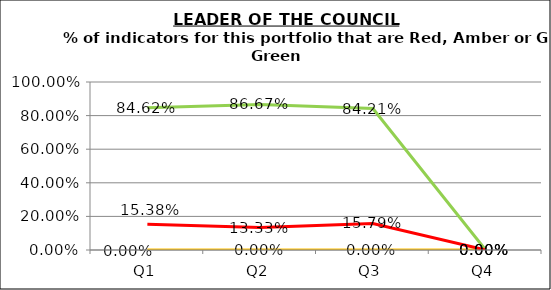
| Category | Green | Amber | Red |
|---|---|---|---|
| Q1 | 0.846 | 0 | 0.154 |
| Q2 | 0.867 | 0 | 0.133 |
| Q3 | 0.842 | 0 | 0.158 |
| Q4 | 0 | 0 | 0 |